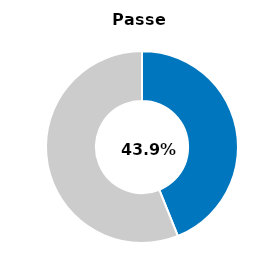
| Category | Series 0 |
|---|---|
| Passed | 0.439 |
| Other | 0.561 |